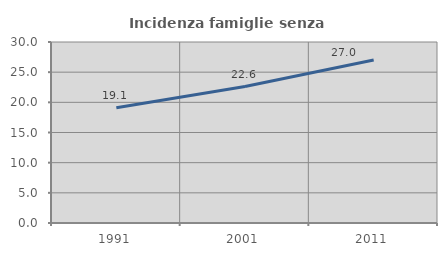
| Category | Incidenza famiglie senza nuclei |
|---|---|
| 1991.0 | 19.116 |
| 2001.0 | 22.617 |
| 2011.0 | 27.026 |